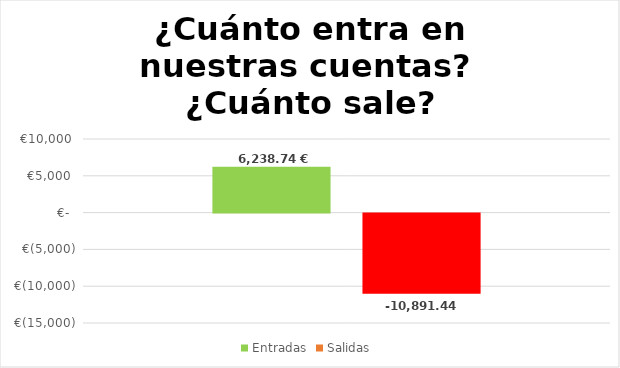
| Category | Entradas | Salidas  |
|---|---|---|
| 0 | 6238.74 | -10891.44 |